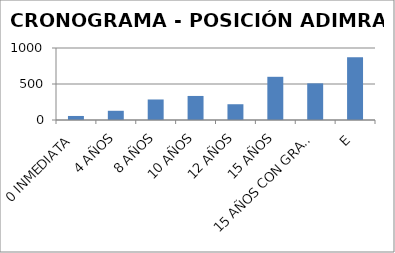
| Category | CANTIDAD DE POSICIONES |
|---|---|
| 0 INMEDIATA | 56 |
| 4 AÑOS | 128 |
| 8 AÑOS | 285 |
| 10 AÑOS | 334 |
| 12 AÑOS | 219 |
| 15 AÑOS | 600 |
| 15 AÑOS CON GRACIA | 509 |
| E | 872 |